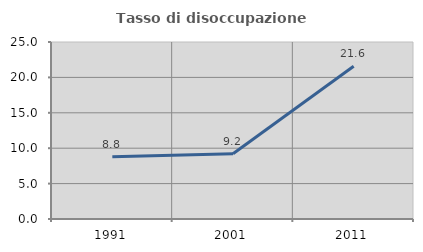
| Category | Tasso di disoccupazione giovanile  |
|---|---|
| 1991.0 | 8.791 |
| 2001.0 | 9.211 |
| 2011.0 | 21.569 |